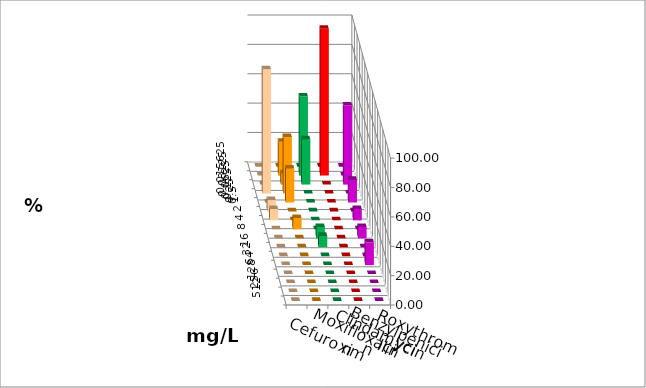
| Category | Cefuroxim | Moxifloxacin | Clindamycin | Benzylpenicillin | Roxythromycin |
|---|---|---|---|---|---|
| 0.015625 | 0 | 0 | 0 | 0 | 0 |
| 0.03125 | 0 | 23.077 | 53.846 | 100 | 0 |
| 0.0625 | 0 | 7.692 | 30.769 | 0 | 53.846 |
| 0.125 | 84.615 | 38.462 | 0 | 0 | 0 |
| 0.25 | 0 | 23.077 | 0 | 0 | 15.385 |
| 0.5 | 7.692 | 0 | 0 | 0 | 0 |
| 1.0 | 7.692 | 0 | 0 | 0 | 7.692 |
| 2.0 | 0 | 7.692 | 0 | 0 | 0 |
| 4.0 | 0 | 0 | 7.692 | 0 | 7.692 |
| 8.0 | 0 | 0 | 7.692 | 0 | 0 |
| 16.0 | 0 | 0 | 0 | 0 | 0 |
| 32.0 | 0 | 0 | 0 | 0 | 15.385 |
| 64.0 | 0 | 0 | 0 | 0 | 0 |
| 128.0 | 0 | 0 | 0 | 0 | 0 |
| 256.0 | 0 | 0 | 0 | 0 | 0 |
| 512.0 | 0 | 0 | 0 | 0 | 0 |